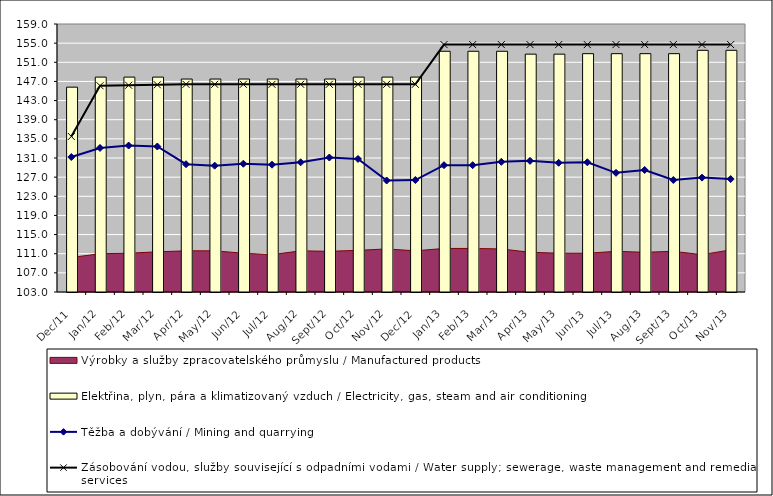
| Category | Elektřina, plyn, pára a klimatizovaný vzduch / Electricity, gas, steam and air conditioning |
|---|---|
| 2011-12-01 | 145.8 |
| 2012-01-01 | 147.9 |
| 2012-02-01 | 147.9 |
| 2012-03-01 | 147.9 |
| 2012-04-01 | 147.5 |
| 2012-05-01 | 147.5 |
| 2012-06-01 | 147.5 |
| 2012-07-01 | 147.5 |
| 2012-08-01 | 147.5 |
| 2012-09-01 | 147.5 |
| 2012-10-01 | 147.9 |
| 2012-11-01 | 147.9 |
| 2012-12-01 | 147.9 |
| 2013-01-01 | 153.3 |
| 2013-02-01 | 153.3 |
| 2013-03-01 | 153.3 |
| 2013-04-01 | 152.7 |
| 2013-05-01 | 152.7 |
| 2013-06-01 | 152.8 |
| 2013-07-01 | 152.8 |
| 2013-08-01 | 152.8 |
| 2013-09-01 | 152.8 |
| 2013-10-01 | 153.5 |
| 2013-11-01 | 153.5 |